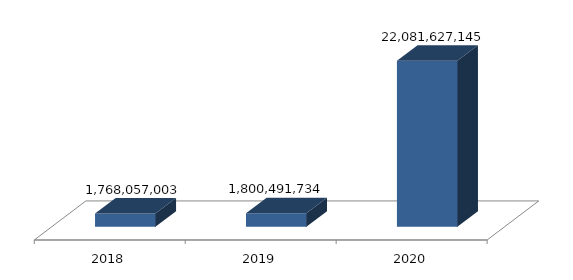
| Category | Series 0 |
|---|---|
| 0 | 1768057003 |
| 1 | 1800491734 |
| 2 | 22081627145 |